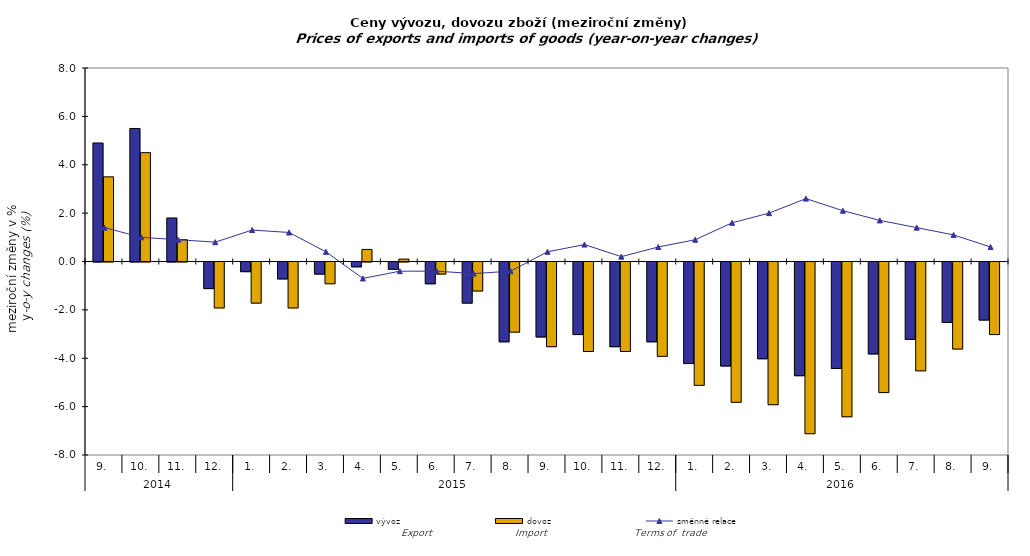
| Category | vývoz | dovoz |
|---|---|---|
| 0 | 4.9 | 3.5 |
| 1 | 5.5 | 4.5 |
| 2 | 1.8 | 0.9 |
| 3 | -1.1 | -1.9 |
| 4 | -0.4 | -1.7 |
| 5 | -0.7 | -1.9 |
| 6 | -0.5 | -0.9 |
| 7 | -0.2 | 0.5 |
| 8 | -0.3 | 0.1 |
| 9 | -0.9 | -0.5 |
| 10 | -1.7 | -1.2 |
| 11 | -3.3 | -2.9 |
| 12 | -3.1 | -3.5 |
| 13 | -3 | -3.7 |
| 14 | -3.5 | -3.7 |
| 15 | -3.3 | -3.9 |
| 16 | -4.2 | -5.1 |
| 17 | -4.3 | -5.8 |
| 18 | -4 | -5.9 |
| 19 | -4.7 | -7.1 |
| 20 | -4.4 | -6.4 |
| 21 | -3.8 | -5.4 |
| 22 | -3.2 | -4.5 |
| 23 | -2.5 | -3.6 |
| 24 | -2.4 | -3 |